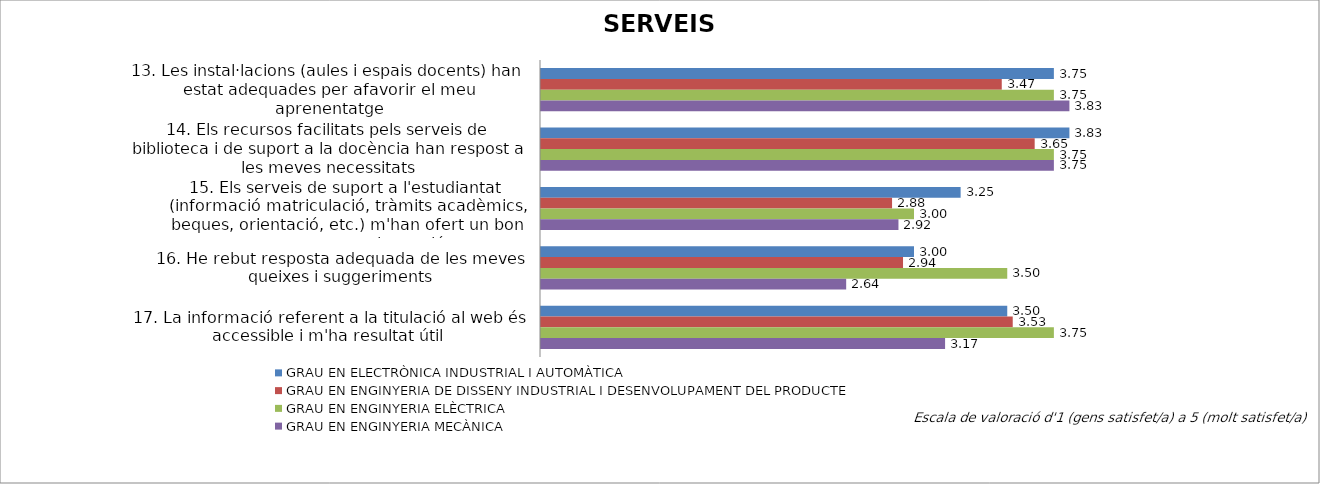
| Category | GRAU EN ELECTRÒNICA INDUSTRIAL I AUTOMÀTICA | GRAU EN ENGINYERIA DE DISSENY INDUSTRIAL I DESENVOLUPAMENT DEL PRODUCTE | GRAU EN ENGINYERIA ELÈCTRICA | GRAU EN ENGINYERIA MECÀNICA |
|---|---|---|---|---|
| 13. Les instal·lacions (aules i espais docents) han estat adequades per afavorir el meu aprenentatge | 3.75 | 3.471 | 3.75 | 3.833 |
| 14. Els recursos facilitats pels serveis de biblioteca i de suport a la docència han respost a les meves necessitats | 3.833 | 3.647 | 3.75 | 3.75 |
| 15. Els serveis de suport a l'estudiantat (informació matriculació, tràmits acadèmics, beques, orientació, etc.) m'han ofert un bon assessorament i atenció | 3.25 | 2.882 | 3 | 2.917 |
| 16. He rebut resposta adequada de les meves queixes i suggeriments | 3 | 2.941 | 3.5 | 2.636 |
| 17. La informació referent a la titulació al web és accessible i m'ha resultat útil | 3.5 | 3.529 | 3.75 | 3.167 |